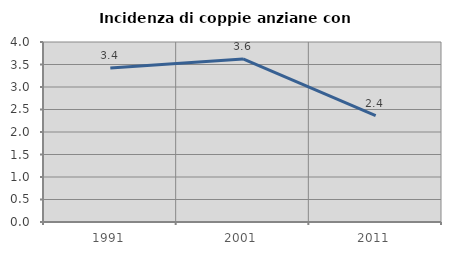
| Category | Incidenza di coppie anziane con figli |
|---|---|
| 1991.0 | 3.425 |
| 2001.0 | 3.623 |
| 2011.0 | 2.362 |